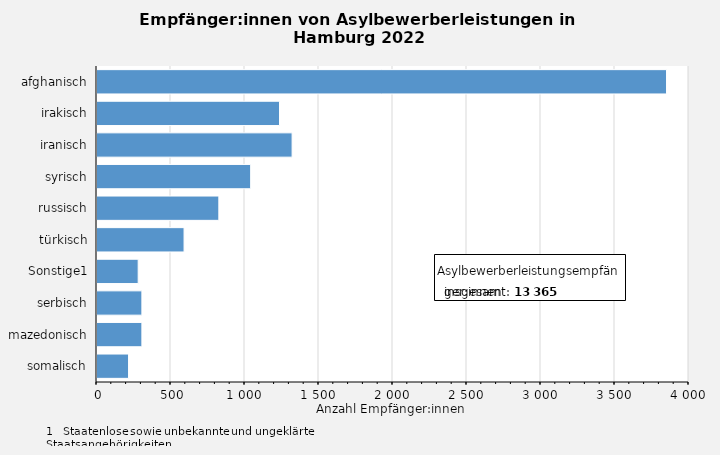
| Category | Anzahl der Empfänger:innen von Asylbewerberleistungen |
|---|---|
| afghanisch | 3855 |
| irakisch | 1240 |
| iranisch | 1325 |
| syrisch | 1045 |
| russisch | 830 |
| türkisch | 595 |
| Sonstige1 | 285 |
| serbisch | 310 |
| mazedonisch | 310 |
| somalisch | 220 |